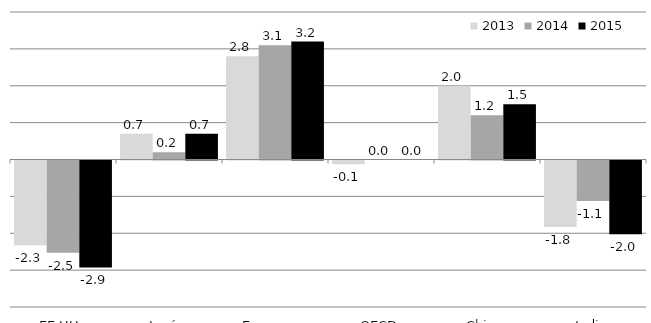
| Category | 2011 | 2012 | 2013 | 2014 | 2015 |
|---|---|---|---|---|---|
| EE.UU. |  |  | -2.3 | -2.5 | -2.9 |
| Japón |  |  | 0.7 | 0.2 | 0.7 |
| Eurozona |  |  | 2.8 | 3.1 | 3.2 |
| OECD |  |  | -0.1 | 0 | 0 |
| China |  |  | 2 | 1.2 | 1.5 |
| India |  |  | -1.8 | -1.1 | -2 |